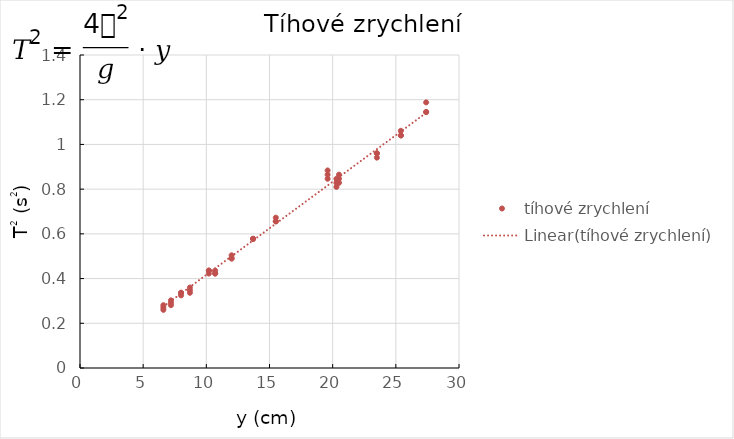
| Category | tíhové zrychlení |
|---|---|
| 12.0 | 0.49 |
| 12.0 | 0.49 |
| 12.0 | 0.504 |
| 23.5 | 0.96 |
| 23.5 | 0.96 |
| 23.5 | 0.941 |
| 7.200000000000003 | 0.281 |
| 7.200000000000003 | 0.292 |
| 7.200000000000003 | 0.303 |
| 6.599999999999994 | 0.27 |
| 6.599999999999994 | 0.26 |
| 6.599999999999994 | 0.281 |
| 10.699999999999996 | 0.436 |
| 10.699999999999996 | 0.423 |
| 10.699999999999996 | 0.423 |
| 8.699999999999996 | 0.336 |
| 8.699999999999996 | 0.348 |
| 8.699999999999996 | 0.36 |
| 8.0 | 0.336 |
| 8.0 | 0.336 |
| 8.0 | 0.325 |
| 15.5 | 0.672 |
| 15.5 | 0.656 |
| 15.5 | 0.656 |
| 20.5 | 0.828 |
| 20.5 | 0.846 |
| 20.5 | 0.865 |
| 13.700000000000003 | 0.578 |
| 13.700000000000003 | 0.578 |
| 13.700000000000003 | 0.578 |
| 27.400000000000002 | 1.145 |
| 27.400000000000002 | 1.145 |
| 27.400000000000002 | 1.188 |
| 19.6 | 0.846 |
| 19.6 | 0.865 |
| 19.6 | 0.884 |
| 10.199999999999996 | 0.436 |
| 10.199999999999996 | 0.423 |
| 10.199999999999996 | 0.436 |
| 25.4 | 1.04 |
| 25.4 | 1.04 |
| 25.4 | 1.061 |
| 20.299999999999997 | 0.81 |
| 20.299999999999997 | 0.828 |
| 20.299999999999997 | 0.846 |